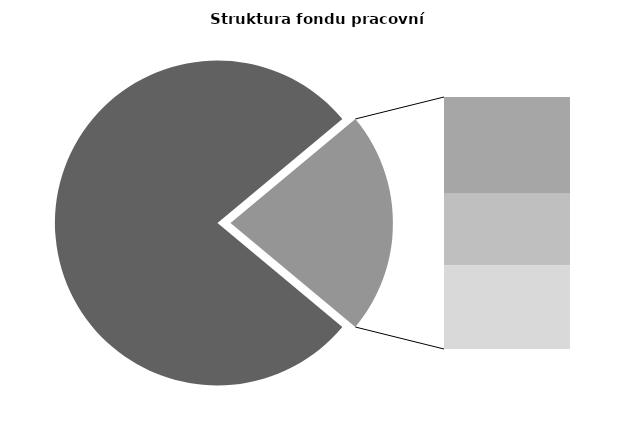
| Category | Series 0 |
|---|---|
| Průměrná měsíční odpracovaná doba bez přesčasu | 131.716 |
| Dovolená | 14.373 |
| Nemoc | 10.638 |
| Jiné | 12.383 |